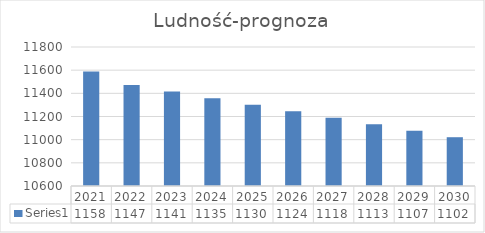
| Category | Series 0 |
|---|---|
| 2021.0 | 11588 |
| 2022.0 | 11472.12 |
| 2023.0 | 11414.759 |
| 2024.0 | 11357.686 |
| 2025.0 | 11300.897 |
| 2026.0 | 11244.393 |
| 2027.0 | 11188.171 |
| 2028.0 | 11132.23 |
| 2029.0 | 11076.569 |
| 2030.0 | 11021.186 |